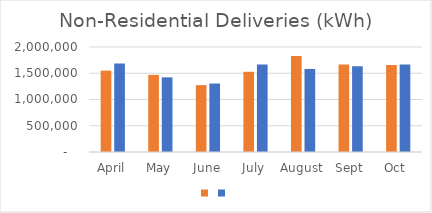
| Category | Series 1 | Series 0 |
|---|---|---|
| April | 1549578 | 1684688 |
| May | 1468470 | 1421957 |
| June | 1273660 | 1304116 |
| July | 1527956 | 1664865 |
| August | 1829758 | 1582276 |
| Sept | 1665239 | 1633351 |
| Oct  | 1657467 | 1665276 |